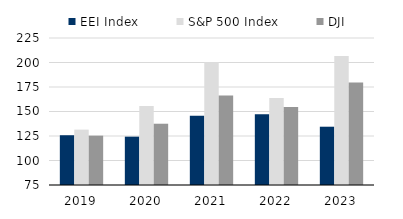
| Category |  EEI Index |  S&P 500 Index |  DJI |
|---|---|---|---|
| 2019.0 | 125.79 | 131.49 | 125.34 |
| 2020.0 | 124.331 | 155.684 | 137.523 |
| 2021.0 | 145.616 | 200.381 | 166.334 |
| 2022.0 | 147.291 | 163.671 | 154.657 |
| 2023.0 | 134.477 | 206.7 | 179.681 |